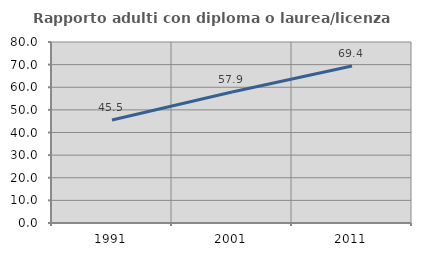
| Category | Rapporto adulti con diploma o laurea/licenza media  |
|---|---|
| 1991.0 | 45.511 |
| 2001.0 | 57.895 |
| 2011.0 | 69.407 |